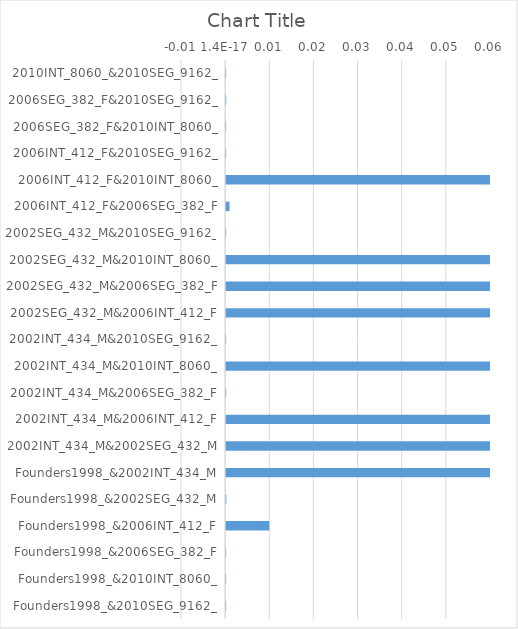
| Category | Series 0 |
|---|---|
| Founders1998_&2010SEG_9162_ | 0 |
| Founders1998_&2010INT_8060_ | 0 |
| Founders1998_&2006SEG_382_F | 0 |
| Founders1998_&2006INT_412_F | 0.01 |
| Founders1998_&2002SEG_432_M | 0 |
| Founders1998_&2002INT_434_M | 0.091 |
| 2002INT_434_M&2002SEG_432_M | 0.965 |
| 2002INT_434_M&2006INT_412_F | 0.902 |
| 2002INT_434_M&2006SEG_382_F | 0 |
| 2002INT_434_M&2010INT_8060_ | 1 |
| 2002INT_434_M&2010SEG_9162_ | 0 |
| 2002SEG_432_M&2006INT_412_F | 0.965 |
| 2002SEG_432_M&2006SEG_382_F | 1 |
| 2002SEG_432_M&2010INT_8060_ | 0.99 |
| 2002SEG_432_M&2010SEG_9162_ | 0 |
| 2006INT_412_F&2006SEG_382_F | 0.001 |
| 2006INT_412_F&2010INT_8060_ | 0.949 |
| 2006INT_412_F&2010SEG_9162_ | 0 |
| 2006SEG_382_F&2010INT_8060_ | 0 |
| 2006SEG_382_F&2010SEG_9162_ | 0 |
| 2010INT_8060_&2010SEG_9162_ | 0 |